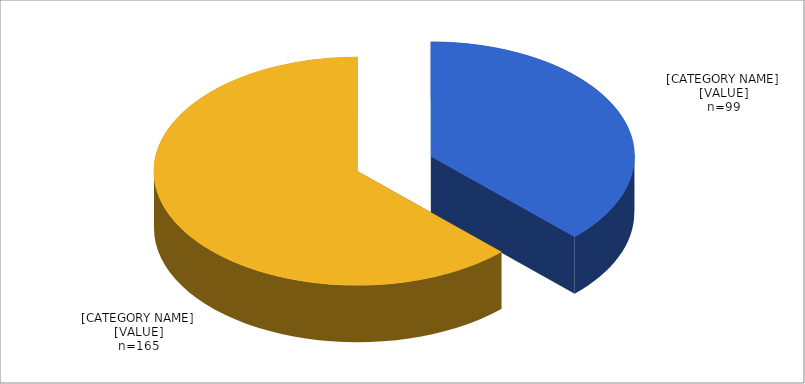
| Category | Series 0 |
|---|---|
| Yes | 0.375 |
| No | 0.625 |